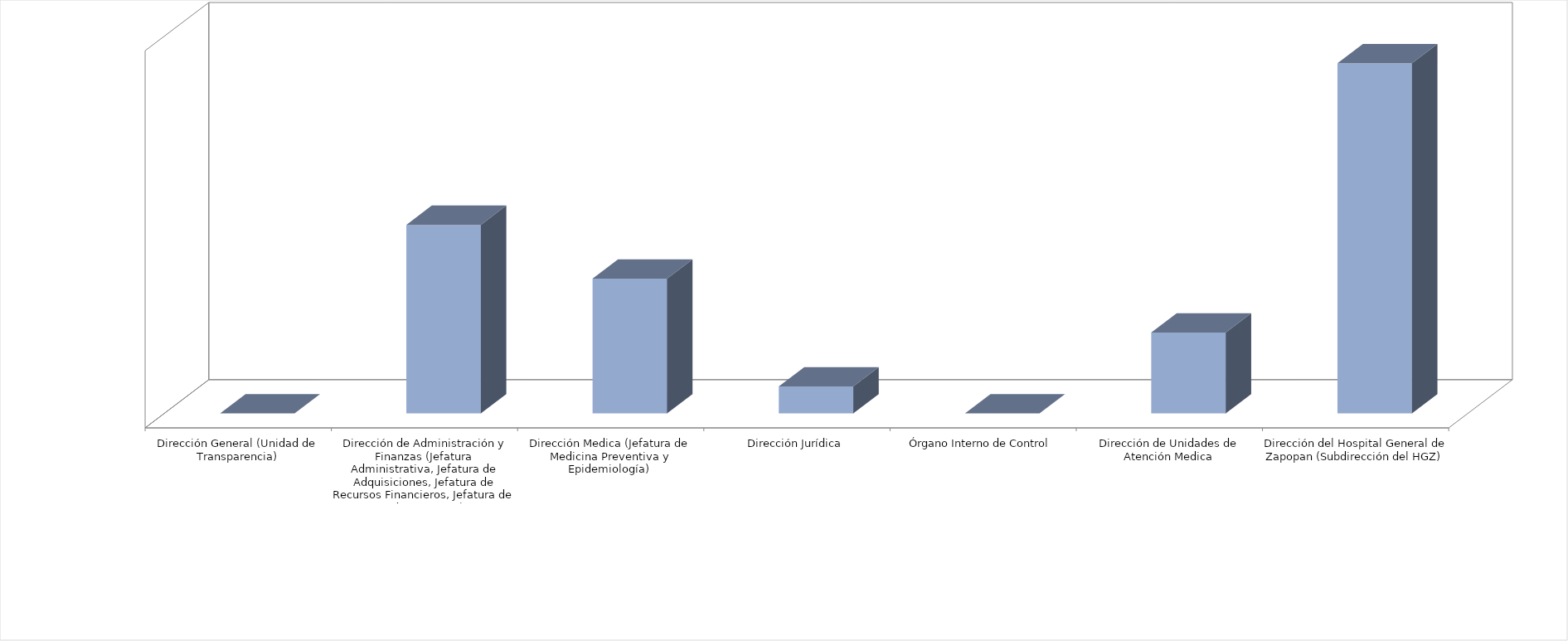
| Category | Series 0 | Series 1 |
|---|---|---|
| Dirección General (Unidad de Transparencia) |  | 0 |
| Dirección de Administración y Finanzas (Jefatura Administrativa, Jefatura de Adquisiciones, Jefatura de Recursos Financieros, Jefatura de Adquisiciones) |  | 7 |
| Dirección Medica (Jefatura de Medicina Preventiva y Epidemiología)  |  | 5 |
| Dirección Jurídica |  | 1 |
| Órgano Interno de Control |  | 0 |
| Dirección de Unidades de Atención Medica |  | 3 |
| Dirección del Hospital General de Zapopan (Subdirección del HGZ) |  | 13 |